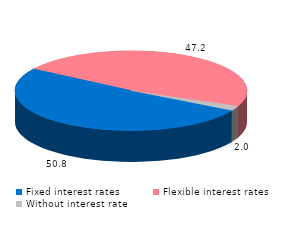
| Category | Series 0 |
|---|---|
| Fixed interest rates | 50.8 |
| Flexible interest rates | 47.2 |
| Without interest rate | 2 |